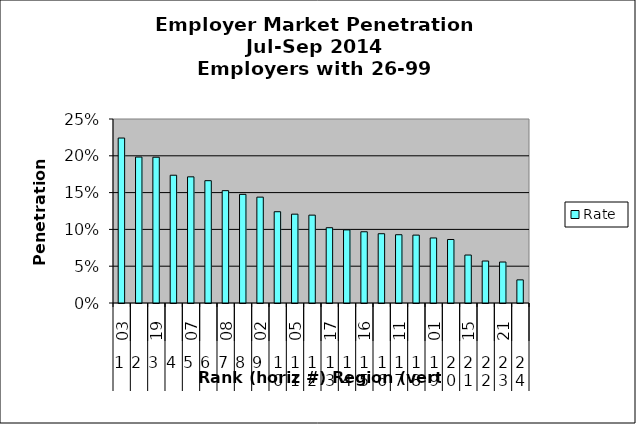
| Category | Rate |
|---|---|
| 0 | 0.224 |
| 1 | 0.198 |
| 2 | 0.198 |
| 3 | 0.174 |
| 4 | 0.171 |
| 5 | 0.166 |
| 6 | 0.153 |
| 7 | 0.148 |
| 8 | 0.144 |
| 9 | 0.124 |
| 10 | 0.121 |
| 11 | 0.119 |
| 12 | 0.102 |
| 13 | 0.099 |
| 14 | 0.097 |
| 15 | 0.094 |
| 16 | 0.093 |
| 17 | 0.092 |
| 18 | 0.088 |
| 19 | 0.086 |
| 20 | 0.065 |
| 21 | 0.057 |
| 22 | 0.056 |
| 23 | 0.031 |